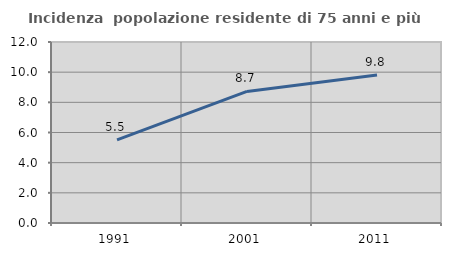
| Category | Incidenza  popolazione residente di 75 anni e più |
|---|---|
| 1991.0 | 5.509 |
| 2001.0 | 8.721 |
| 2011.0 | 9.806 |